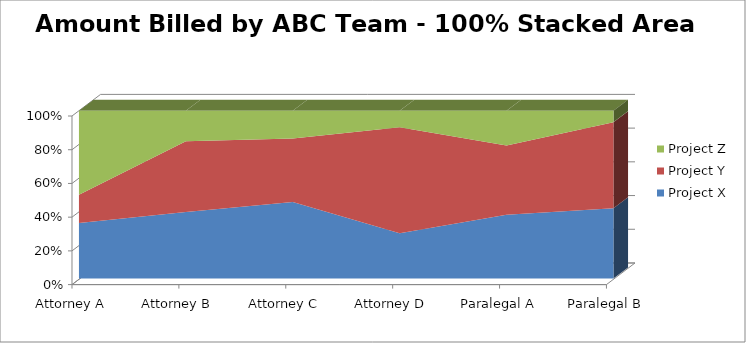
| Category | Project X | Project Y | Project Z |
|---|---|---|---|
| Attorney A | 29765 | 15000 | 44500 |
| Attorney B | 19897 | 21000 | 9000 |
| Attorney C | 27987 | 23000 | 10000 |
| Attorney D | 13908 | 32000 | 5000 |
| Paralegal A | 12999 | 14000 | 7000 |
| Paralegal B | 12400 | 15000 | 2000 |